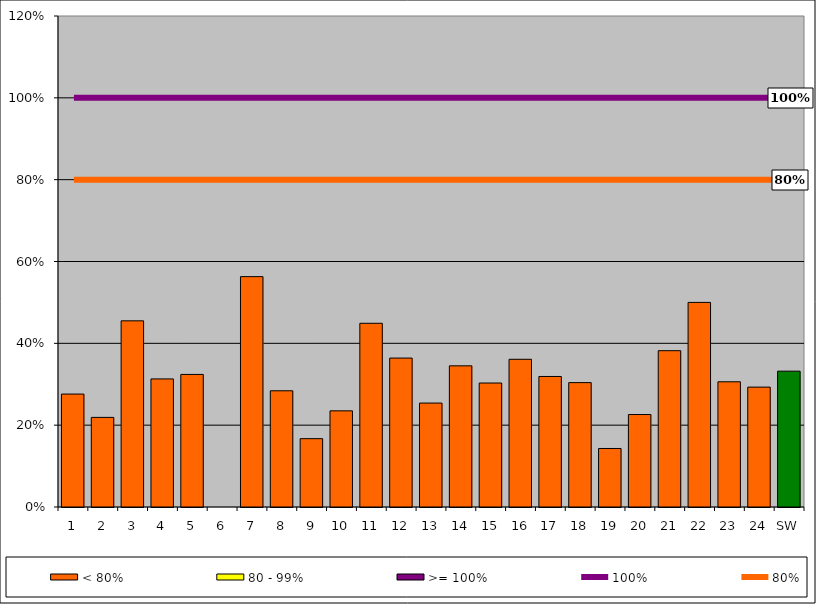
| Category | < 80% | 80 - 99% | >= 100% |
|---|---|---|---|
| 1 | 0.276 | 0 | 0 |
| 2 | 0.219 | 0 | 0 |
| 3 | 0.455 | 0 | 0 |
| 4 | 0.313 | 0 | 0 |
| 5 | 0.324 | 0 | 0 |
| 6 | 0 | 0 | 0 |
| 7 | 0.563 | 0 | 0 |
| 8 | 0.284 | 0 | 0 |
| 9 | 0.167 | 0 | 0 |
| 10 | 0.235 | 0 | 0 |
| 11 | 0.449 | 0 | 0 |
| 12 | 0.364 | 0 | 0 |
| 13 | 0.254 | 0 | 0 |
| 14 | 0.345 | 0 | 0 |
| 15 | 0.303 | 0 | 0 |
| 16 | 0.361 | 0 | 0 |
| 17 | 0.319 | 0 | 0 |
| 18 | 0.304 | 0 | 0 |
| 19 | 0.143 | 0 | 0 |
| 20 | 0.226 | 0 | 0 |
| 21 | 0.382 | 0 | 0 |
| 22 | 0.5 | 0 | 0 |
| 23 | 0.306 | 0 | 0 |
| 24 | 0.293 | 0 | 0 |
| SW | 0.332 | 0 | 0 |